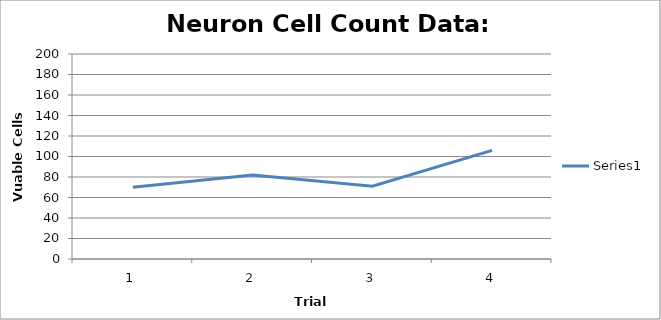
| Category | Series 0 |
|---|---|
| 0 | 70 |
| 1 | 82 |
| 2 | 71 |
| 3 | 106 |